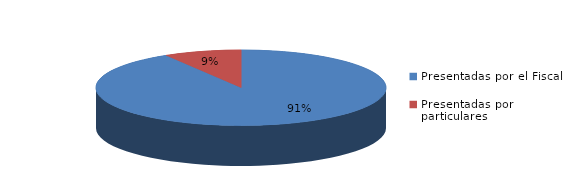
| Category | Series 0 |
|---|---|
| Presentadas por el Fiscal | 95 |
| Presentadas por particulares | 9 |